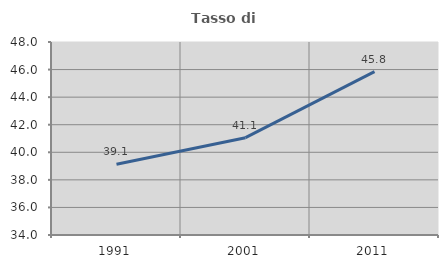
| Category | Tasso di occupazione   |
|---|---|
| 1991.0 | 39.138 |
| 2001.0 | 41.058 |
| 2011.0 | 45.847 |